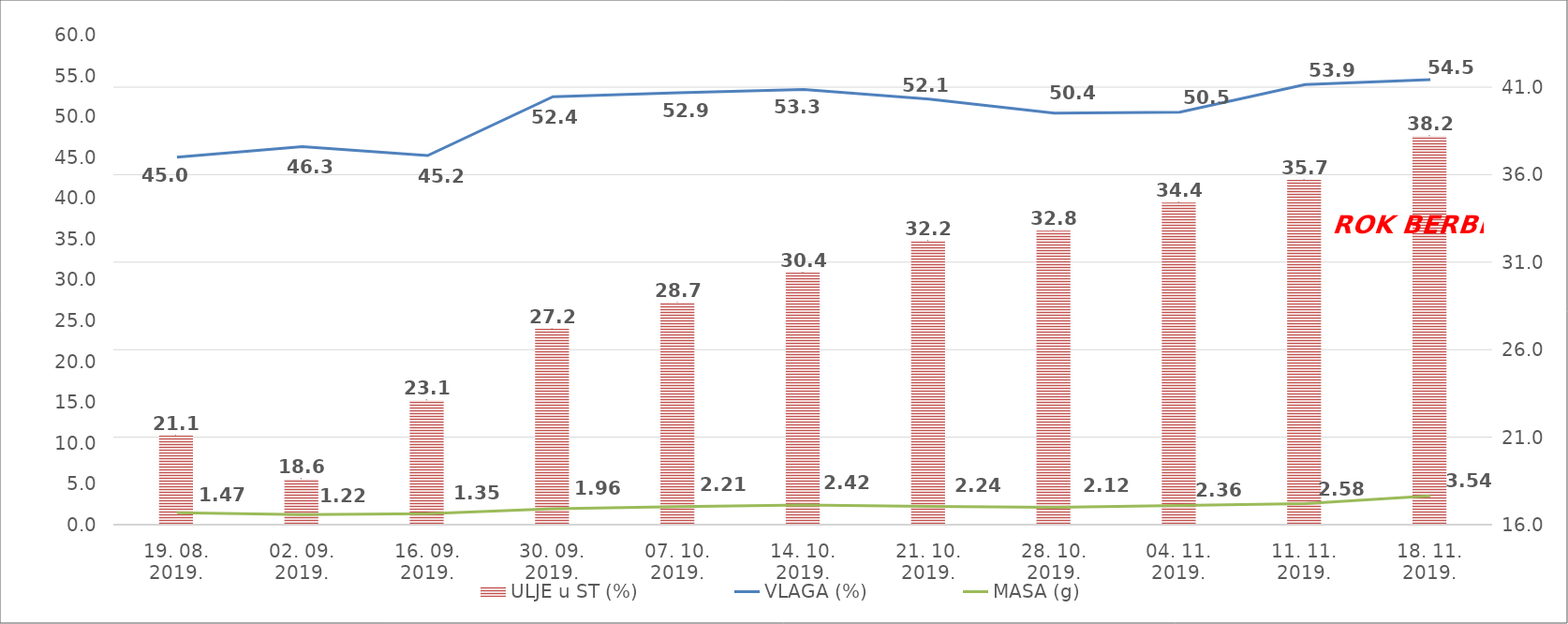
| Category | ULJE u ST (%) |
|---|---|
| 19. 08. 2019. | 21.1 |
| 02. 09. 2019. | 18.6 |
| 16. 09. 2019. | 23.1 |
| 30. 09. 2019. | 27.2 |
| 07. 10. 2019. | 28.7 |
| 14. 10. 2019. | 30.4 |
| 21. 10. 2019. | 32.2 |
| 28. 10. 2019. | 32.8 |
| 04. 11. 2019. | 34.4 |
| 11. 11. 2019. | 35.7 |
| 18. 11. 2019. | 38.2 |